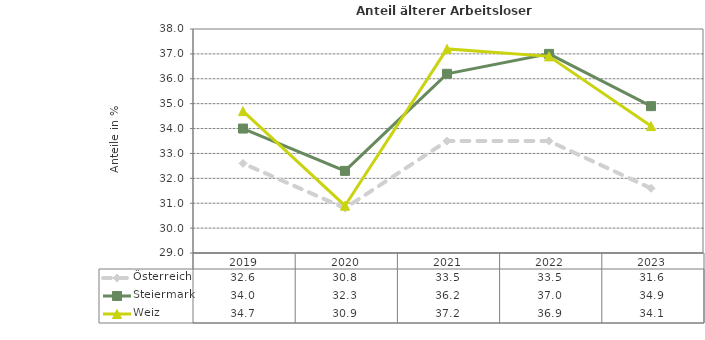
| Category | Österreich | Steiermark | Weiz |
|---|---|---|---|
| 2023.0 | 31.6 | 34.9 | 34.1 |
| 2022.0 | 33.5 | 37 | 36.9 |
| 2021.0 | 33.5 | 36.2 | 37.2 |
| 2020.0 | 30.8 | 32.3 | 30.9 |
| 2019.0 | 32.6 | 34 | 34.7 |